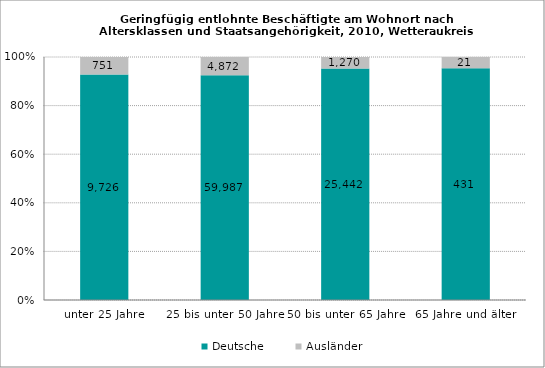
| Category | Deutsche | Ausländer |
|---|---|---|
| unter 25 Jahre | 9726 | 751 |
| 25 bis unter 50 Jahre | 59987 | 4872 |
| 50 bis unter 65 Jahre | 25442 | 1270 |
| 65 Jahre und älter | 431 | 21 |